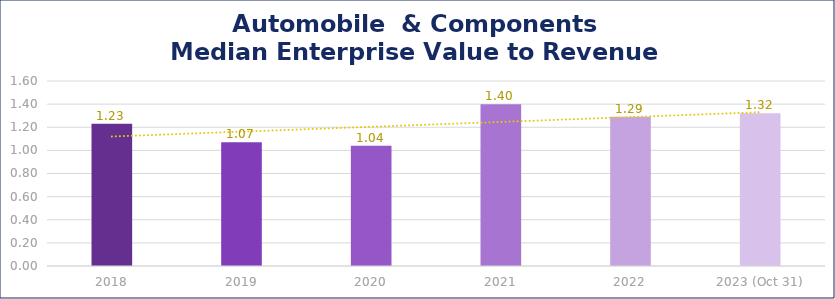
| Category | Automobile  & Components |
|---|---|
| 2018 | 1.23 |
| 2019 | 1.07 |
| 2020 | 1.04 |
| 2021 | 1.4 |
| 2022 | 1.29 |
| 2023 (Oct 31) | 1.32 |